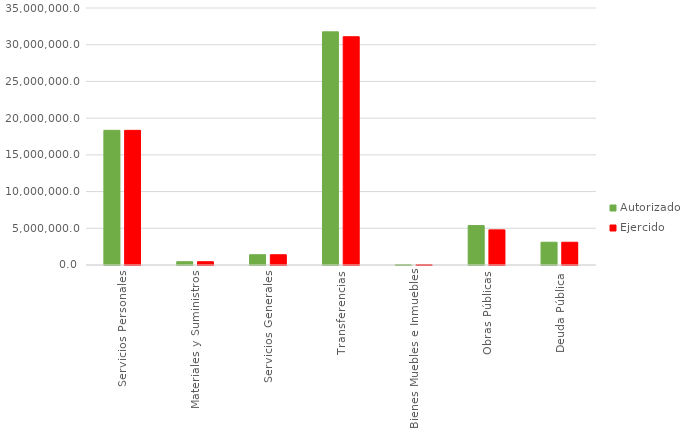
| Category | Autorizado | Ejercido |
|---|---|---|
| Servicios Personales | 18338564.3 | 18337420.7 |
| Materiales y Suministros | 447048.1 | 445448.9 |
| Servicios Generales | 1398791.6 | 1397396.6 |
| Transferencias | 31751575.9 | 31087373.7 |
| Bienes Muebles e Inmuebles | 35562 | 35395.1 |
| Obras Públicas | 5369054.3 | 4785292.8 |
| Deuda Pública | 3099697.9 | 3099697.8 |